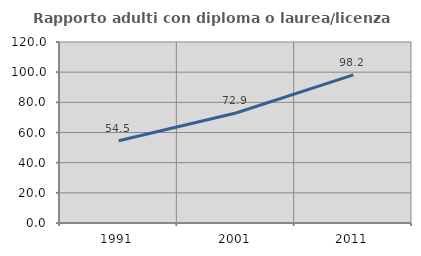
| Category | Rapporto adulti con diploma o laurea/licenza media  |
|---|---|
| 1991.0 | 54.511 |
| 2001.0 | 72.932 |
| 2011.0 | 98.222 |